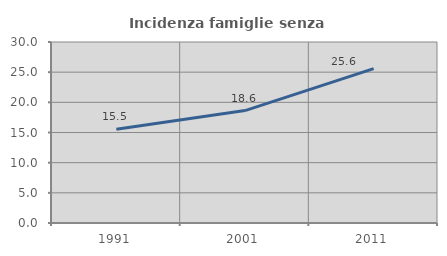
| Category | Incidenza famiglie senza nuclei |
|---|---|
| 1991.0 | 15.534 |
| 2001.0 | 18.629 |
| 2011.0 | 25.584 |